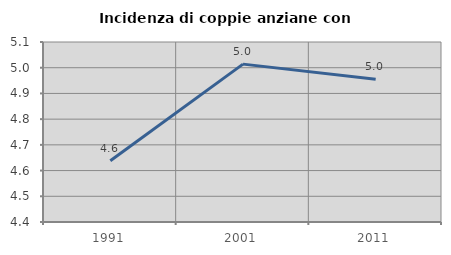
| Category | Incidenza di coppie anziane con figli |
|---|---|
| 1991.0 | 4.638 |
| 2001.0 | 5.014 |
| 2011.0 | 4.955 |